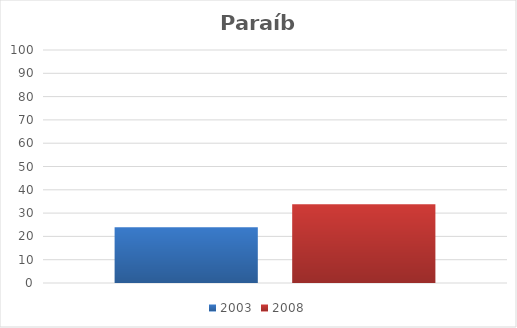
| Category | 2003 | 2008 |
|---|---|---|
| Total | 23.9 | 33.8 |